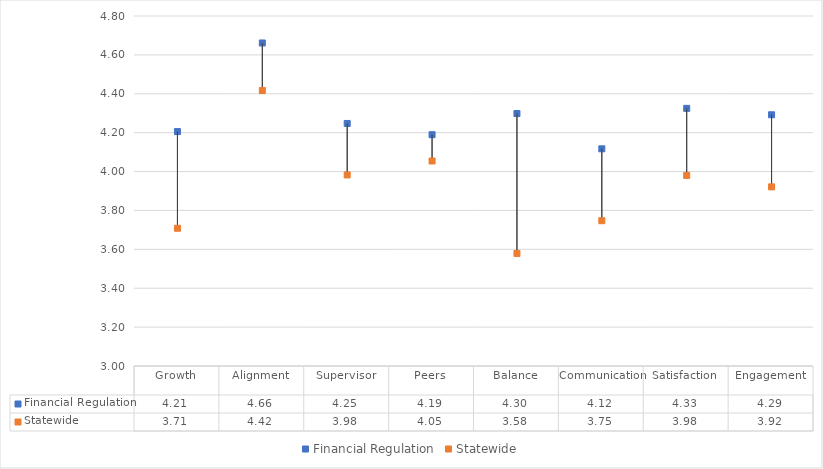
| Category | Financial Regulation | Statewide |
|---|---|---|
| Growth | 4.206 | 3.708 |
| Alignment | 4.661 | 4.417 |
| Supervisor | 4.247 | 3.983 |
| Peers | 4.19 | 4.054 |
| Balance | 4.298 | 3.579 |
| Communication | 4.117 | 3.747 |
| Satisfaction | 4.325 | 3.98 |
| Engagement | 4.292 | 3.921 |